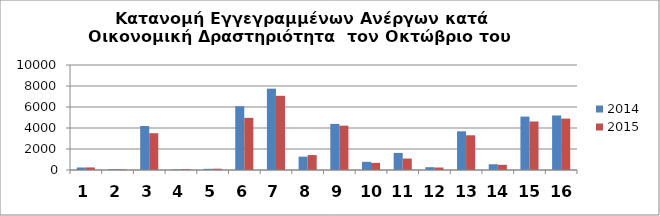
| Category | 2014 | 2015 |
|---|---|---|
| 0 | 237 | 244 |
| 1 | 86 | 65 |
| 2 | 4189 | 3504 |
| 3 | 45 | 79 |
| 4 | 112 | 125 |
| 5 | 6071 | 4968 |
| 6 | 7746 | 7066 |
| 7 | 1272 | 1421 |
| 8 | 4391 | 4220 |
| 9 | 780 | 680 |
| 10 | 1626 | 1093 |
| 11 | 267 | 235 |
| 12 | 3685 | 3307 |
| 13 | 545 | 495 |
| 14 | 5088 | 4619 |
| 15 | 5194 | 4895 |